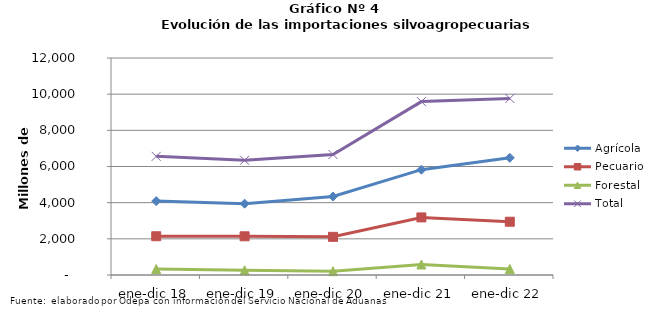
| Category | Agrícola | Pecuario | Forestal | Total |
|---|---|---|---|---|
| ene-dic 18 | 4085984 | 2142776 | 331427 | 6560187 |
| ene-dic 19 | 3945256 | 2140199 | 260080 | 6345535 |
| ene-dic 20 | 4338913 | 2110613 | 213634 | 6663160 |
| ene-dic 21 | 5824346 | 3184594 | 580660 | 9589600 |
| ene-dic 22 | 6480954 | 2945753 | 335036 | 9761743 |